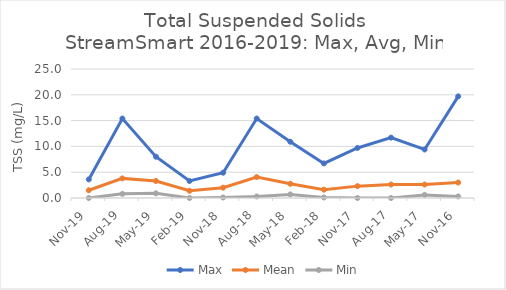
| Category | Max | Mean | Min |
|---|---|---|---|
| 2019-11-01 | 3.6 | 1.5 | 0 |
| 2019-08-01 | 15.4 | 3.8 | 0.8 |
| 2019-05-01 | 8 | 3.3 | 0.9 |
| 2019-02-01 | 3.3 | 1.4 | 0 |
| 2018-11-01 | 4.9 | 2 | 0.1 |
| 2018-08-01 | 15.4 | 4.053 | 0.3 |
| 2018-05-01 | 10.9 | 2.753 | 0.7 |
| 2018-02-01 | 6.7 | 1.611 | 0.1 |
| 2017-11-01 | 9.7 | 2.3 | 0 |
| 2017-08-01 | 11.7 | 2.609 | 0 |
| 2017-05-01 | 9.4 | 2.606 | 0.6 |
| 2016-11-01 | 19.7 | 3 | 0.3 |